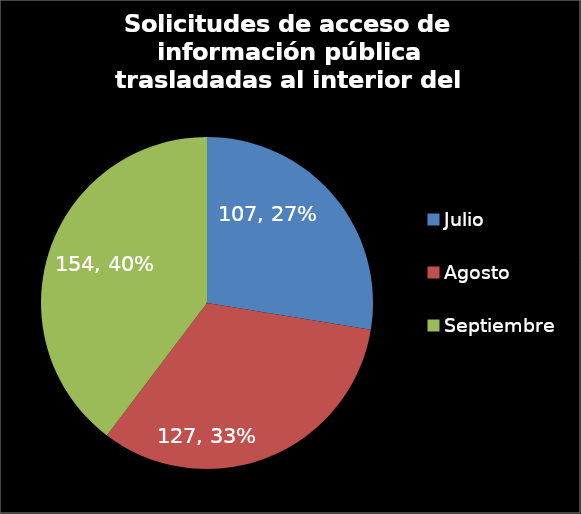
| Category | Series 0 |
|---|---|
| Julio | 107 |
| Agosto | 127 |
| Septiembre | 154 |